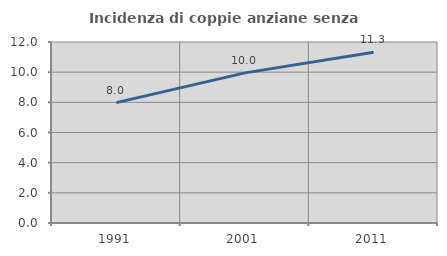
| Category | Incidenza di coppie anziane senza figli  |
|---|---|
| 1991.0 | 7.982 |
| 2001.0 | 9.953 |
| 2011.0 | 11.317 |